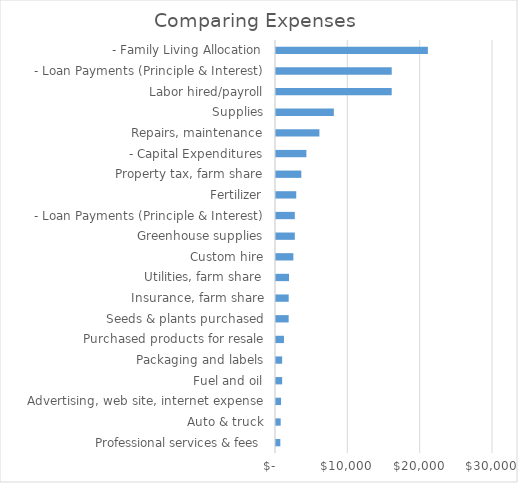
| Category | Series 0 |
|---|---|
|     Professional services & fees | 600 |
|     Auto & truck | 650 |
|     Advertising, web site, internet expense | 700 |
|     Fuel and oil | 850 |
|     Packaging and labels | 850 |
|     Purchased products for resale | 1100 |
|     Seeds & plants purchased | 1750 |
|     Insurance, farm share | 1755 |
|     Utilities, farm share | 1800 |
|     Custom hire | 2400 |
|     Greenhouse supplies | 2600 |
|  - Loan Payments (Principle & Interest) | 2600 |
|     Fertilizer | 2800 |
|     Property tax, farm share | 3500 |
|  - Capital Expenditures | 4200 |
|     Repairs, maintenance | 6000 |
|     Supplies | 8000 |
|     Labor hired/payroll | 16000 |
|  - Loan Payments (Principle & Interest) | 16000 |
|  - Family Living Allocation | 21000 |